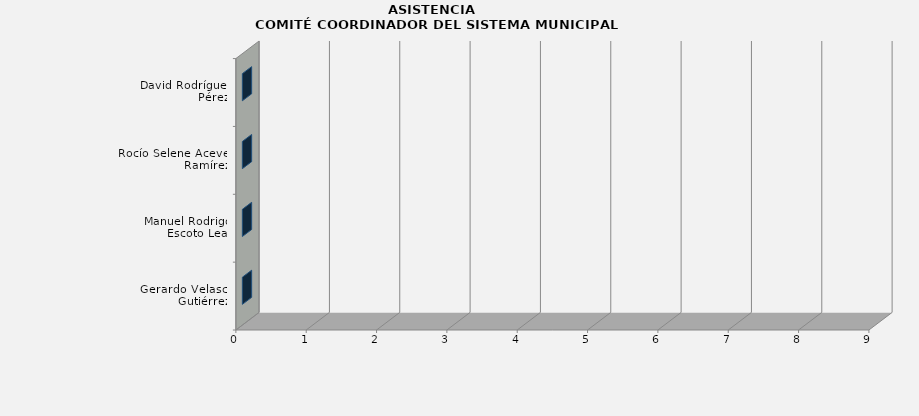
| Category | Series 0 |
|---|---|
| Gerardo Velasco Gutiérrez | 0 |
| Manuel Rodrigo Escoto Leal | 0 |
| Rocío Selene Aceves Ramírez | 0 |
| David Rodríguez Pérez | 0 |